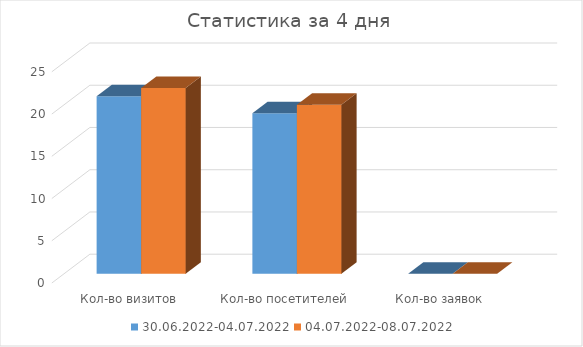
| Category | 30.06.2022-04.07.2022 | 04.07.2022-08.07.2022 |
|---|---|---|
| Кол-во визитов | 21 | 22 |
| Кол-во посетителей | 19 | 20 |
| Кол-во заявок | 0 | 0 |